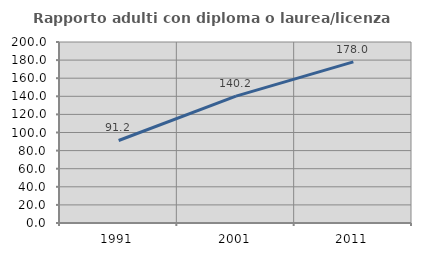
| Category | Rapporto adulti con diploma o laurea/licenza media  |
|---|---|
| 1991.0 | 91.176 |
| 2001.0 | 140.212 |
| 2011.0 | 178.046 |